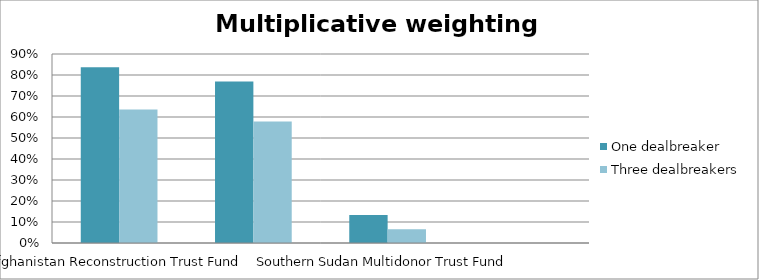
| Category | One dealbreaker | Three dealbreakers |
|---|---|---|
| Afghanistan Reconstruction Trust Fund | 0.837 | 0.636 |
| Liberia Health Sector Pooled Fund | 0.769 | 0.578 |
| Southern Sudan Multidonor Trust Fund | 0.133 | 0.066 |
| Your fund | 0 | 0 |